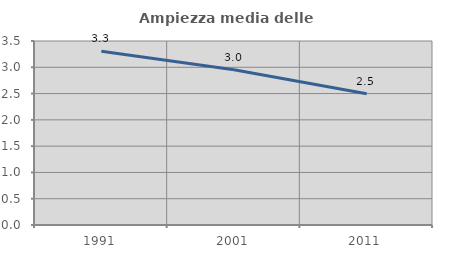
| Category | Ampiezza media delle famiglie |
|---|---|
| 1991.0 | 3.306 |
| 2001.0 | 2.954 |
| 2011.0 | 2.498 |